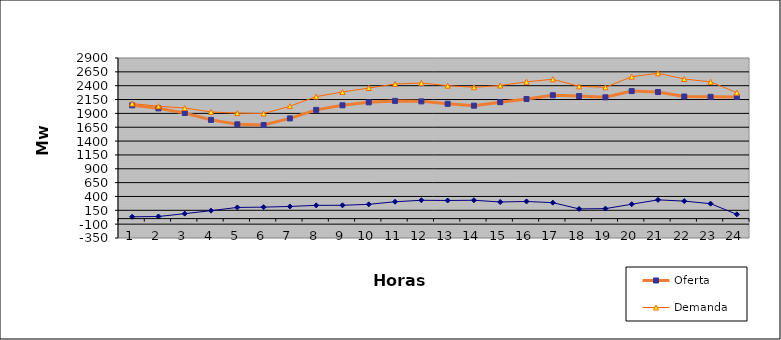
| Category | Oferta | Demanda | No Servida |
|---|---|---|---|
| 1.0 | 2045.25 | 2077.902 | 32.652 |
| 2.0 | 1990.33 | 2028.517 | 38.187 |
| 3.0 | 1907.37 | 1997.045 | 89.675 |
| 4.0 | 1782.45 | 1925.963 | 143.513 |
| 5.0 | 1702.27 | 1904.2 | 201.93 |
| 6.0 | 1689.67 | 1896.968 | 207.298 |
| 7.0 | 1809.27 | 2029.125 | 219.855 |
| 8.0 | 1963.5 | 2203.122 | 239.622 |
| 9.0 | 2045.98 | 2286.575 | 240.595 |
| 10.0 | 2099.47 | 2357.688 | 258.218 |
| 11.0 | 2125.44 | 2429.986 | 304.546 |
| 12.0 | 2116.98 | 2448.084 | 331.104 |
| 13.0 | 2073.07 | 2400.316 | 327.246 |
| 14.0 | 2039.12 | 2370.55 | 331.43 |
| 15.0 | 2102.63 | 2402.709 | 300.079 |
| 16.0 | 2160.15 | 2470.023 | 309.873 |
| 17.0 | 2227.59 | 2515.683 | 288.093 |
| 18.0 | 2212.83 | 2388.031 | 175.201 |
| 19.0 | 2190.06 | 2370.7 | 180.64 |
| 20.0 | 2302.7 | 2562.269 | 259.569 |
| 21.0 | 2285.39 | 2624.156 | 338.766 |
| 22.0 | 2204.86 | 2520.722 | 315.862 |
| 23.0 | 2198.92 | 2468.972 | 270.052 |
| 24.0 | 2196.72 | 2273.97 | 77.25 |